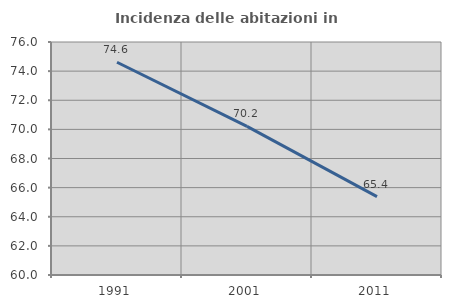
| Category | Incidenza delle abitazioni in proprietà  |
|---|---|
| 1991.0 | 74.609 |
| 2001.0 | 70.208 |
| 2011.0 | 65.378 |